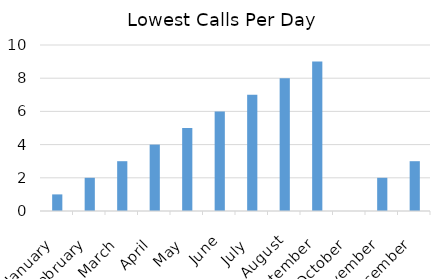
| Category | Lowest Calls Per Day |
|---|---|
| 1900-01-01 | 1 |
| 1900-02-28 | 2 |
| 1900-03-31 | 3 |
| 1900-04-30 | 4 |
| 1900-05-31 | 5 |
| 1900-06-30 | 6 |
| 1900-07-31 | 7 |
| 1900-08-31 | 8 |
| 1900-09-30 | 9 |
| 1900-10-31 | 0 |
| 1900-11-30 | 2 |
| 1900-12-31 | 3 |